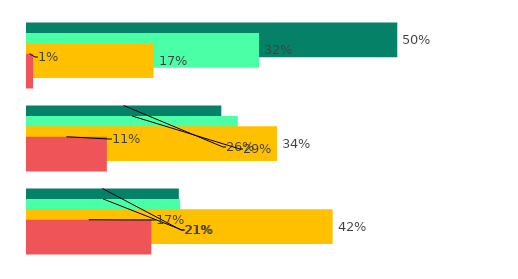
| Category | Extrêmement important | Très important | Important | Pas du tout important |
|---|---|---|---|---|
| 0 | 50.378 | 31.568 | 17.227 | 0.828 |
| 1 | 26.434 | 28.681 | 34.018 | 10.866 |
| 2 | 20.659 | 20.836 | 41.584 | 16.921 |